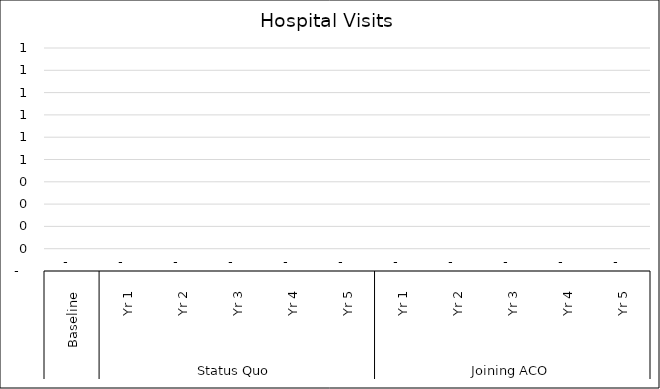
| Category | Hospital Visits |
|---|---|
| 0 | 0 |
| 1 | 0 |
| 2 | 0 |
| 3 | 0 |
| 4 | 0 |
| 5 | 0 |
| 6 | 0 |
| 7 | 0 |
| 8 | 0 |
| 9 | 0 |
| 10 | 0 |